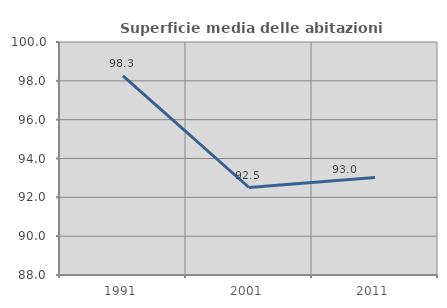
| Category | Superficie media delle abitazioni occupate |
|---|---|
| 1991.0 | 98.252 |
| 2001.0 | 92.506 |
| 2011.0 | 93.018 |